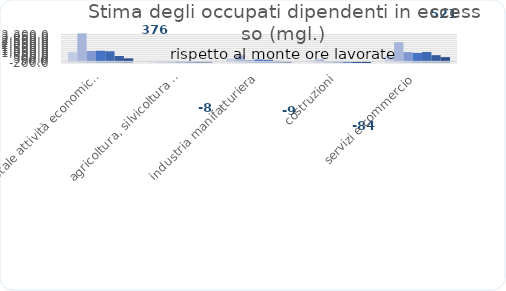
| Category | T1-2020 | T2-2020 | T3-2020 | T4-2020 | T1-2021 | T2-2021 | T3-2021 |
|---|---|---|---|---|---|---|---|
| totale attività economiche | 1147.266 | 3458.168 | 1280.02 | 1309.803 | 1249.714 | 662.313 | 375.625 |
| agricoltura, silvicoltura e pesca | 17.708 | 57.171 | 0.006 | 13.885 | -7.406 | -14.271 | -7.687 |
| industria manifatturiera | 342.505 | 757.828 | 137.934 | 232.453 | 188.067 | 61.068 | -9.235 |
| costruzioni | 80.824 | 240.475 | 26.73 | 36.42 | -46.31 | -96.287 | -83.796 |
| servizi e commercio | 678.422 | 2364.292 | 1143.697 | 1038.913 | 1161.498 | 765.611 | 521.209 |